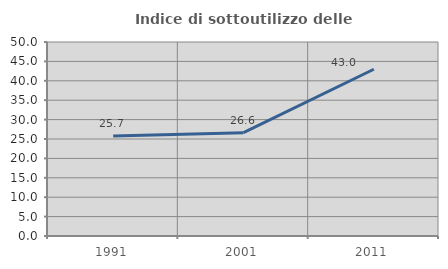
| Category | Indice di sottoutilizzo delle abitazioni  |
|---|---|
| 1991.0 | 25.748 |
| 2001.0 | 26.633 |
| 2011.0 | 42.979 |